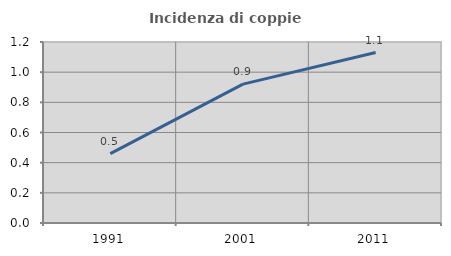
| Category | Incidenza di coppie miste |
|---|---|
| 1991.0 | 0.46 |
| 2001.0 | 0.921 |
| 2011.0 | 1.13 |